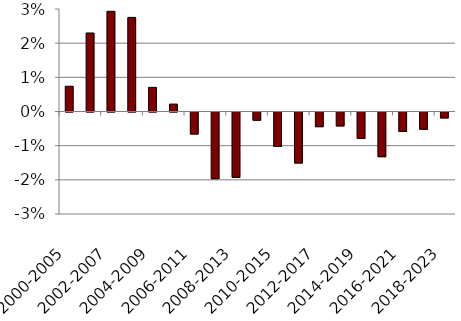
| Category | 60/40 |
|---|---|
| 2000-2005 | 0.007 |
| 2001-2006 | 0.023 |
| 2002-2007 | 0.029 |
| 2003-2008 | 0.028 |
| 2004-2009 | 0.007 |
| 2005-2010 | 0.002 |
| 2006-2011 | -0.006 |
| 2007-2012 | -0.02 |
| 2008-2013 | -0.019 |
| 2009-2014 | -0.002 |
| 2010-2015 | -0.01 |
| 2011-2016 | -0.015 |
| 2012-2017 | -0.004 |
| 2013-2018 | -0.004 |
| 2014-2019 | -0.008 |
| 2015-2020 | -0.013 |
| 2016-2021 | -0.006 |
| 2017-2022 | -0.005 |
| 2018-2023 | -0.002 |